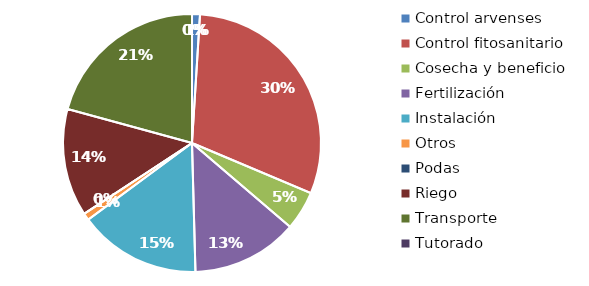
| Category | Valor |
|---|---|
| Control arvenses | 504000 |
| Control fitosanitario | 15450000 |
| Cosecha y beneficio | 2500000 |
| Fertilización | 6775000 |
| Instalación | 7788000 |
| Otros | 450000 |
| Podas | 0 |
| Riego | 6862000 |
| Transporte | 10565000 |
| Tutorado | 0 |